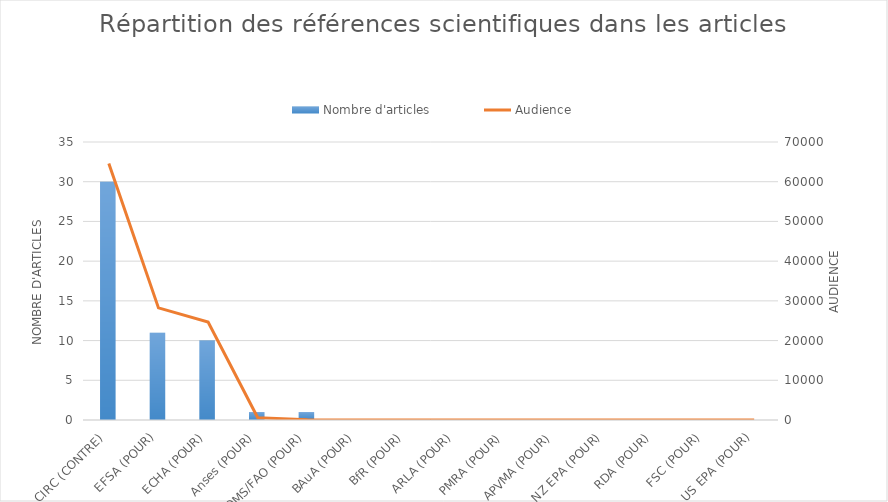
| Category | Nombre d'articles |
|---|---|
| CIRC (CONTRE) | 30 |
| EFSA (POUR) | 11 |
| ECHA (POUR) | 10 |
| Anses (POUR) | 1 |
| OMS/FAO (POUR) | 1 |
| BAuA (POUR) | 0 |
| BfR (POUR) | 0 |
| ARLA (POUR) | 0 |
| PMRA (POUR) | 0 |
| APVMA (POUR) | 0 |
| NZ EPA (POUR) | 0 |
| RDA (POUR) | 0 |
| FSC (POUR) | 0 |
| US EPA (POUR) | 0 |